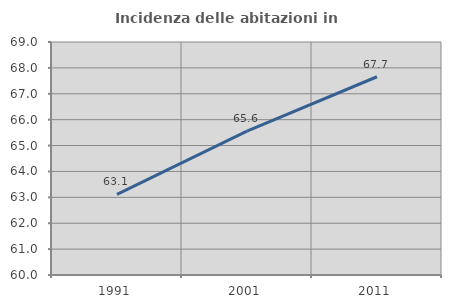
| Category | Incidenza delle abitazioni in proprietà  |
|---|---|
| 1991.0 | 63.113 |
| 2001.0 | 65.559 |
| 2011.0 | 67.658 |